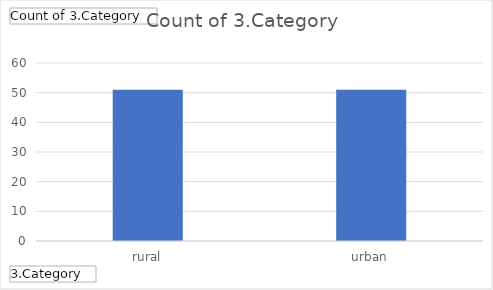
| Category | Total |
|---|---|
| rural | 51 |
| urban | 51 |